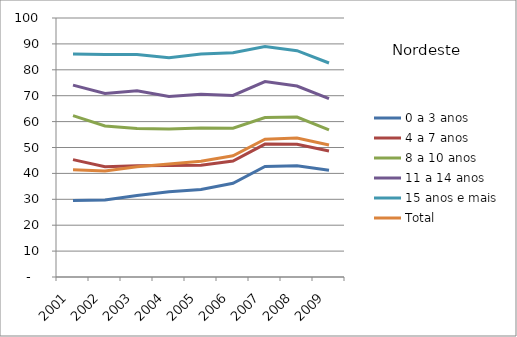
| Category | 0 a 3 anos | 4 a 7 anos | 8 a 10 anos | 11 a 14 anos | 15 anos e mais | Total |
|---|---|---|---|---|---|---|
| 2001.0 | 29.58 | 45.33 | 62.31 | 74.1 | 86.11 | 41.39 |
| 2002.0 | 29.7 | 42.61 | 58.33 | 70.88 | 85.93 | 40.9 |
| 2003.0 | 31.45 | 42.96 | 57.33 | 71.88 | 85.92 | 42.56 |
| 2004.0 | 32.88 | 43.03 | 57.12 | 69.71 | 84.69 | 43.6 |
| 2005.0 | 33.76 | 43.17 | 57.5 | 70.53 | 86.13 | 44.7 |
| 2006.0 | 36.17 | 44.77 | 57.47 | 70.1 | 86.57 | 46.81 |
| 2007.0 | 42.66 | 51.31 | 61.59 | 75.44 | 88.95 | 53.21 |
| 2008.0 | 42.92 | 51.24 | 61.74 | 73.74 | 87.38 | 53.62 |
| 2009.0 | 41.2 | 48.63 | 56.82 | 68.88 | 82.63 | 50.99 |